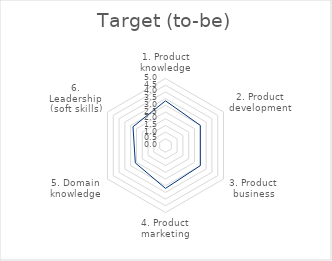
| Category | Target (to-be) |
|---|---|
| 1. Product knowledge | 3.333 |
| 2. Product development | 3 |
| 3. Product business | 3 |
| 4. Product marketing | 3.2 |
| 5. Domain knowledge | 2.6 |
| 6. Leadership (soft skills) | 2.8 |